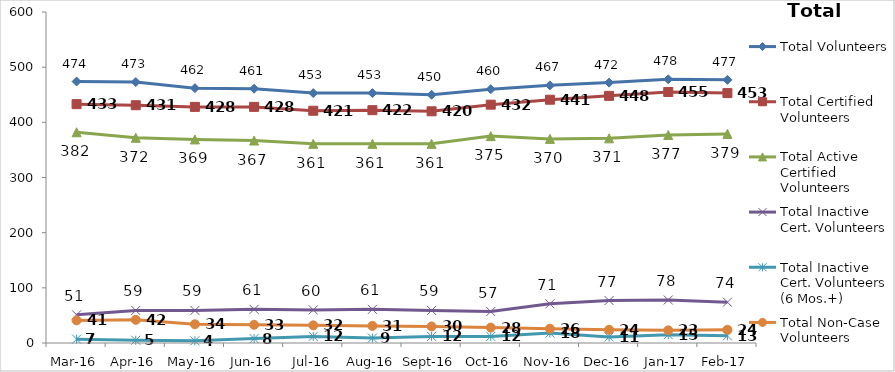
| Category | Total Volunteers | Total Certified Volunteers | Total Active Certified Volunteers | Total Inactive Cert. Volunteers | Total Inactive Cert. Volunteers (6 Mos.+) | Total Non-Case Volunteers |
|---|---|---|---|---|---|---|
| Mar-16 | 474 | 433 | 382 | 51 | 7 | 41 |
| Apr-16 | 473 | 431 | 372 | 59 | 5 | 42 |
| May-16 | 462 | 428 | 369 | 59 | 4 | 34 |
| Jun-16 | 461 | 428 | 367 | 61 | 8 | 33 |
| Jul-16 | 453 | 421 | 361 | 60 | 12 | 32 |
| Aug-16 | 453 | 422 | 361 | 61 | 9 | 31 |
| Sep-16 | 450 | 420 | 361 | 59 | 12 | 30 |
| Oct-16 | 460 | 432 | 375 | 57 | 12 | 28 |
| Nov-16 | 467 | 441 | 370 | 71 | 18 | 26 |
| Dec-16 | 472 | 448 | 371 | 77 | 11 | 24 |
| Jan-17 | 478 | 455 | 377 | 78 | 15 | 23 |
| Feb-17 | 477 | 453 | 379 | 74 | 13 | 24 |